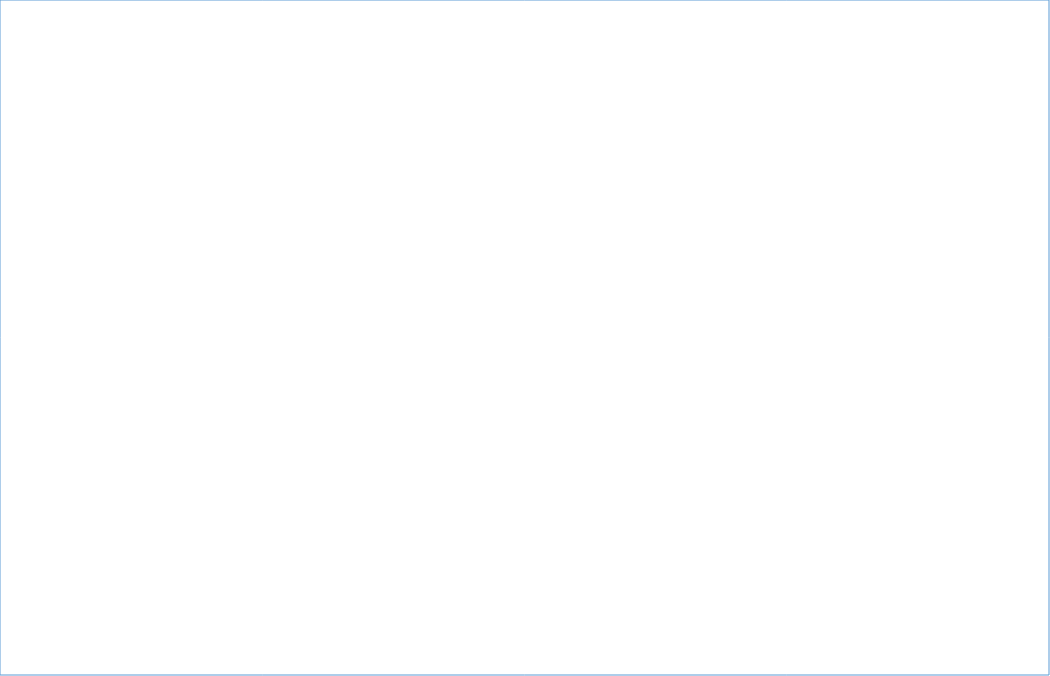
| Category | Total Population | # of People adopt basic personal and community hygiene practices | # of people access to functioning  sanitation facilities | # of people Equitable and continuous access to sufficient quantity of domestic water |
|---|---|---|---|---|
| Ah Nauk Ywe | 4717 | 4717 | 4129 | 1284.837 |
| Basare | 2111 | 1895 | 2111 | 2111 |
| Baw Du Pha 1 | 4892 | 4892 | 4130 | 4892 |
| Baw Du Pha 2 | 6936 | 6936 | 5830 | 6936 |
| Dar Pai | 11625 | 11625 | 8160 | 11625 |
| Dar Pai (IDP in host families) | 3360 | 3360 | 0 | 3360 |
| Kyauk Ta Lone | 979 | 979 | 979 | 979 |
| Kyein Ni Pyin | 6042 | 6042 | 3930 | 6042 |
| Maw Ti Ngar | 3486 | 3486 | 3486 | 3486 |
| Nget Chaung 1 | 4645 | 4645 | 2074 | 4645 |
| Nget Chaung 2 | 4104 | 4104 | 3023 | 2717.656 |
| NiDin | 581 | 0 | 581 | 581 |
| Ohn Taw Chay | 3095 | 3095 | 3095 | 3095 |
| Ohn Taw Gyi (North) | 13302 | 13302 | 8870 | 13302 |
| Ohn Taw Gyi (South) | 11487 | 11487 | 6816 | 11487 |
| Say Tha Mar Gyi | 11564 | 11564 | 11564 | 11564 |
| Sin Tet Maw | 2805 | 2805 | 2805 | 2805 |
| Taung Paw | 2920 | 2920 | 2920 | 2920 |
| Thae Chaung | 6016 | 6016 | 4020 | 6016 |
| Thet Kae Pyin  | 5950 | 5950 | 5030 | 5950 |
| Thet Kae Pyin Village (IDPs in host family) | 1670 | 1670 | 800 | 1670 |
| Khaung Doke Khar 2 (Hmanzi) | 2186 | 2186 | 1710 | 2186 |
| Khaung Doke Khar 1 | 2248 | 2248 | 2200 | 2248 |
| Phwe Yar Kone (Say Tha Mar Gyi) | 2285 | 2285 | 2285 | 2285 |
| Baw Du Pha Village (IDP in host families) | 114 | 114 | 100 | 114 |